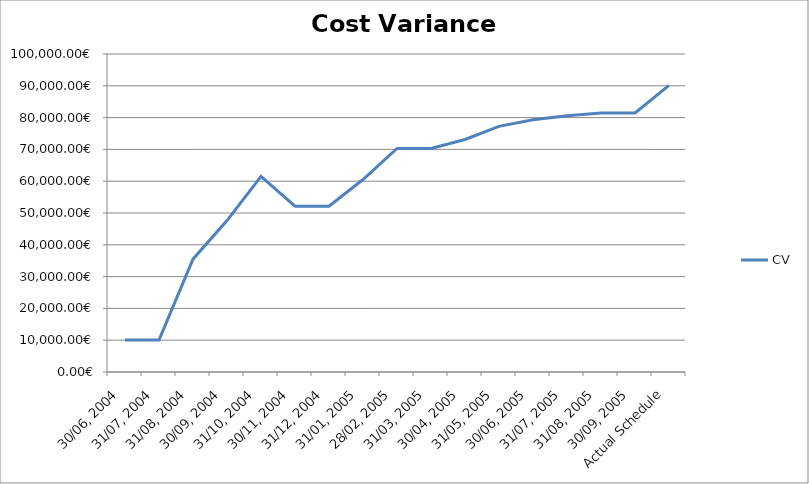
| Category | CV |
|---|---|
| 30/06, 2004 | 10045.56 |
| 31/07, 2004 | 10032.106 |
| 31/08, 2004 | 35491.396 |
| 30/09, 2004 | 47623.588 |
| 31/10, 2004 | 61503.847 |
| 30/11, 2004 | 52140.55 |
| 31/12, 2004 | 52140.552 |
| 31/01, 2005 | 60522.714 |
| 28/02, 2005 | 70286.076 |
| 31/03, 2005 | 70286.078 |
| 30/04, 2005 | 73112.733 |
| 31/05, 2005 | 77235.215 |
| 30/06, 2005 | 79307.983 |
| 31/07, 2005 | 80599.773 |
| 31/08, 2005 | 81459.282 |
| 30/09, 2005 | 81459.286 |
| Actual Schedule | 90159.283 |